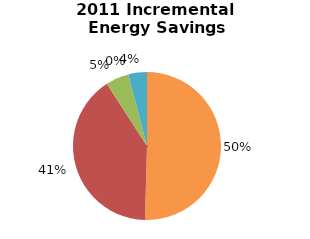
| Category | Incremental Energy Savings (kWh) |
|---|---|
| Consumer Program Total | 1087988.864 |
| Business Program Total | 872352.69 |
| Industrial Program Total | 109094.063 |
| Home Assistance Program Total | 0 |
| Pre-2011 Programs completed in 2011 Total | 88043.142 |